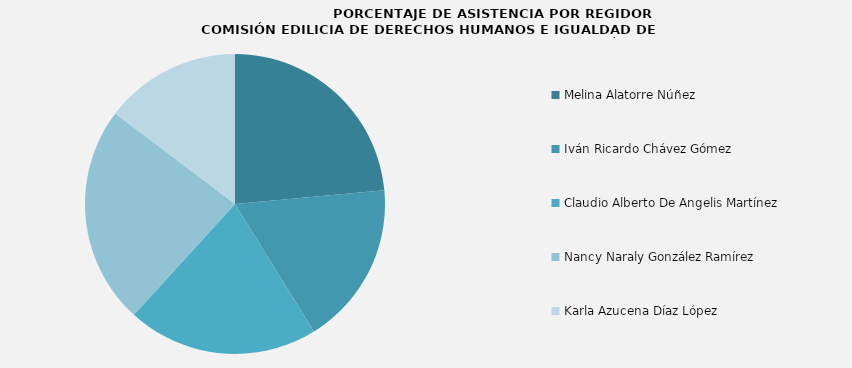
| Category | Series 0 |
|---|---|
| Melina Alatorre Núñez | 100 |
| Iván Ricardo Chávez Gómez | 75 |
| Claudio Alberto De Angelis Martínez | 87.5 |
| Nancy Naraly González Ramírez | 100 |
| Karla Azucena Díaz López | 62.5 |